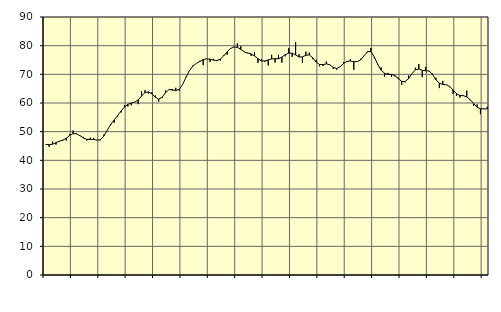
| Category | Piggar | Series 1 |
|---|---|---|
| nan | 45.5 | 45.55 |
| 87.0 | 44.7 | 45.47 |
| 87.0 | 46.6 | 45.63 |
| 87.0 | 45.5 | 46.15 |
| nan | 46.5 | 46.67 |
| 88.0 | 46.9 | 47.06 |
| 88.0 | 46.9 | 47.72 |
| 88.0 | 49.2 | 48.69 |
| nan | 50.4 | 49.32 |
| 89.0 | 49.4 | 49.28 |
| 89.0 | 48.8 | 48.59 |
| 89.0 | 48.2 | 47.78 |
| nan | 46.9 | 47.32 |
| 90.0 | 47.9 | 47.29 |
| 90.0 | 47.8 | 47.3 |
| 90.0 | 47 | 47.02 |
| nan | 47 | 47.22 |
| 91.0 | 49 | 48.52 |
| 91.0 | 50.6 | 50.51 |
| 91.0 | 52.3 | 52.54 |
| nan | 53.1 | 54.08 |
| 92.0 | 55.3 | 55.55 |
| 92.0 | 56.7 | 57.19 |
| 92.0 | 59.3 | 58.56 |
| nan | 58.8 | 59.55 |
| 93.0 | 59.2 | 60 |
| 93.0 | 60.2 | 60.27 |
| 93.0 | 59.6 | 61.09 |
| nan | 64.1 | 62.43 |
| 94.0 | 64.5 | 63.61 |
| 94.0 | 63.3 | 63.88 |
| 94.0 | 63.8 | 63.16 |
| nan | 62.6 | 62.07 |
| 95.0 | 60.5 | 61.34 |
| 95.0 | 61.7 | 62 |
| 95.0 | 64.4 | 63.6 |
| nan | 64.7 | 64.67 |
| 96.0 | 64.2 | 64.66 |
| 96.0 | 65.3 | 64.29 |
| 96.0 | 64.3 | 64.79 |
| nan | 66.5 | 66.45 |
| 97.0 | 69.2 | 69.02 |
| 97.0 | 71.3 | 71.32 |
| 97.0 | 73.1 | 72.86 |
| nan | 73.8 | 73.79 |
| 98.0 | 74.7 | 74.46 |
| 98.0 | 73.2 | 75.12 |
| 98.0 | 75.4 | 75.4 |
| nan | 74.3 | 75.31 |
| 99.0 | 75.4 | 74.95 |
| 99.0 | 74.6 | 74.82 |
| 99.0 | 74.8 | 75.31 |
| nan | 76.6 | 76.42 |
| 0.0 | 76.8 | 77.88 |
| 0.0 | 79.2 | 79.02 |
| 0.0 | 79.6 | 79.53 |
| nan | 80.8 | 79.4 |
| 1.0 | 79.8 | 78.71 |
| 1.0 | 78 | 77.85 |
| 1.0 | 77.5 | 77.41 |
| nan | 76.4 | 77.12 |
| 2.0 | 77.7 | 76.4 |
| 2.0 | 74 | 75.42 |
| 2.0 | 75.2 | 74.67 |
| nan | 74.3 | 74.66 |
| 3.0 | 73.1 | 75.03 |
| 3.0 | 76.8 | 75.36 |
| 3.0 | 74.1 | 75.46 |
| nan | 76.8 | 75.44 |
| 4.0 | 74.1 | 75.99 |
| 4.0 | 76.3 | 76.87 |
| 4.0 | 79.1 | 77.4 |
| nan | 76.1 | 77.39 |
| 5.0 | 81.2 | 76.76 |
| 5.0 | 77 | 76.04 |
| 5.0 | 74 | 76.1 |
| nan | 77.9 | 76.65 |
| 6.0 | 77.6 | 76.78 |
| 6.0 | 75.3 | 75.78 |
| 6.0 | 75 | 74.25 |
| nan | 72.8 | 73.42 |
| 7.0 | 72.9 | 73.4 |
| 7.0 | 74.5 | 73.66 |
| 7.0 | 73.4 | 73.3 |
| nan | 71.9 | 72.41 |
| 8.0 | 71.6 | 72.01 |
| 8.0 | 72.7 | 72.65 |
| 8.0 | 74.3 | 73.78 |
| nan | 74.4 | 74.53 |
| 9.0 | 75.3 | 74.63 |
| 9.0 | 71.6 | 74.42 |
| 9.0 | 74.6 | 74.44 |
| nan | 75.4 | 75.03 |
| 10.0 | 76.4 | 76.47 |
| 10.0 | 77.7 | 77.9 |
| 10.0 | 79.2 | 77.93 |
| nan | 75.6 | 76.07 |
| 11.0 | 73.6 | 73.46 |
| 11.0 | 72.4 | 71.44 |
| 11.0 | 69.2 | 70.37 |
| nan | 70.5 | 69.97 |
| 12.0 | 69.1 | 69.96 |
| 12.0 | 69.3 | 69.6 |
| 12.0 | 68.9 | 68.48 |
| nan | 66.4 | 67.55 |
| 13.0 | 67.2 | 67.49 |
| 13.0 | 69.6 | 68.48 |
| 13.0 | 70.2 | 70.24 |
| nan | 72.3 | 71.6 |
| 14.0 | 73.6 | 71.84 |
| 14.0 | 69 | 71.4 |
| 14.0 | 72.6 | 71.24 |
| nan | 71.1 | 71.17 |
| 15.0 | 70.3 | 69.98 |
| 15.0 | 68.8 | 68.14 |
| 15.0 | 65.2 | 66.91 |
| nan | 67.7 | 66.45 |
| 16.0 | 66.4 | 66.39 |
| 16.0 | 65.5 | 65.78 |
| 16.0 | 63.2 | 64.56 |
| nan | 62.5 | 63.27 |
| 17.0 | 61.9 | 62.59 |
| 17.0 | 62.7 | 62.57 |
| 17.0 | 64.3 | 62.12 |
| nan | 61 | 61.16 |
| 18.0 | 59.1 | 59.83 |
| 18.0 | 59.5 | 58.55 |
| 18.0 | 56.1 | 57.98 |
| nan | 58.1 | 57.94 |
| 19.0 | 58.7 | 57.93 |